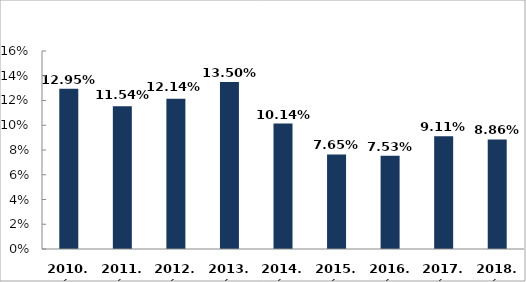
| Category | Series 1 |
|---|---|
| 2010. év | 0.129 |
| 2011. év | 0.115 |
| 2012. év | 0.121 |
| 2013. év | 0.135 |
| 2014. év | 0.101 |
| 2015. év | 0.076 |
| 2016. év | 0.075 |
| 2017. év | 0.091 |
| 2018. év | 0.089 |